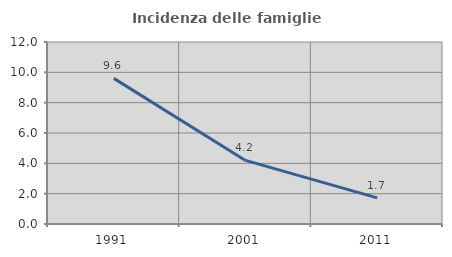
| Category | Incidenza delle famiglie numerose |
|---|---|
| 1991.0 | 9.601 |
| 2001.0 | 4.192 |
| 2011.0 | 1.725 |